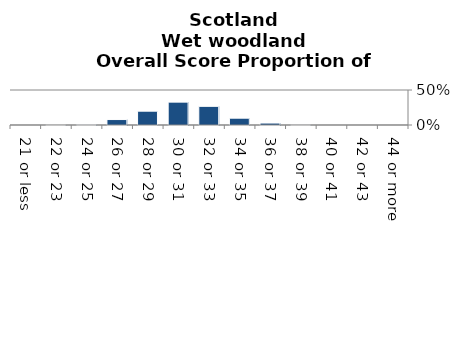
| Category | Wet woodland |
|---|---|
| 21 or less | 0 |
| 22 or 23 | 0 |
| 24 or 25 | 0.005 |
| 26 or 27 | 0.078 |
| 28 or 29 | 0.197 |
| 30 or 31 | 0.327 |
| 32 or 33 | 0.267 |
| 34 or 35 | 0.097 |
| 36 or 37 | 0.028 |
| 38 or 39 | 0.001 |
| 40 or 41 | 0 |
| 42 or 43 | 0 |
| 44 or more | 0 |